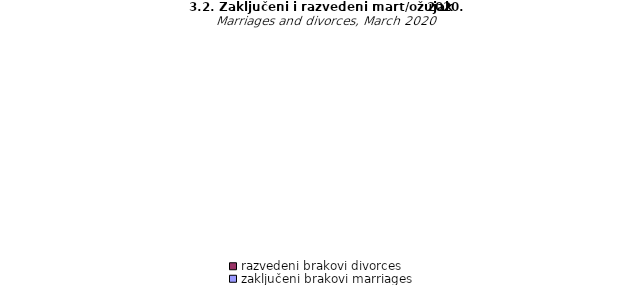
| Category | zaključeni brakovi marriages | razvedeni brakovi divorces |
|---|---|---|
| Unsko - sanski | 64 | 22 |
| Kanton Posavski | 3 | 2 |
| Tuzlanski | 128 | 22 |
| Zeničko - dobojski | 129 | 9 |
| Bosansko - podrinjski | 5 | 3 |
| Srednjobosanski | 72 | 2 |
| Hercegovačko-
neretvanski | 36 | 7 |
| Zapadnohercegovački | 14 | 1 |
| Kanton Sarajevo | 115 | 5 |
| Kanton 10 | 6 | 1 |